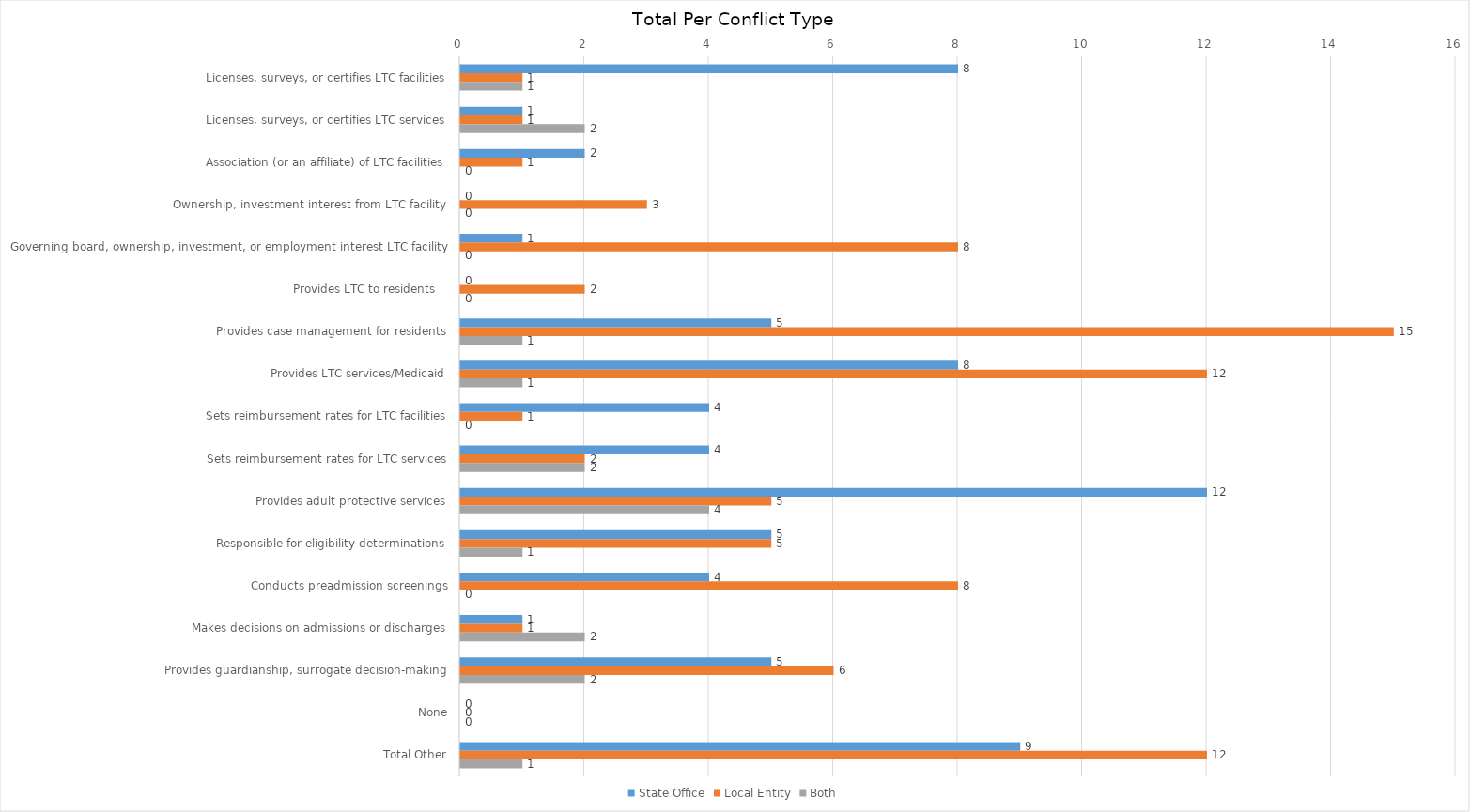
| Category | State Office | Local Entity | Both |
|---|---|---|---|
| Licenses, surveys, or certifies LTC facilities | 8 | 1 | 1 |
| Licenses, surveys, or certifies LTC services | 1 | 1 | 2 |
| Association (or an affiliate) of LTC facilities | 2 | 1 | 0 |
| Ownership, investment interest from LTC facility | 0 | 3 | 0 |
| Governing board, ownership, investment, or employment interest LTC facility | 1 | 8 | 0 |
| Provides LTC to residents    | 0 | 2 | 0 |
| Provides case management for residents | 5 | 15 | 1 |
| Provides LTC services/Medicaid | 8 | 12 | 1 |
| Sets reimbursement rates for LTC facilities | 4 | 1 | 0 |
| Sets reimbursement rates for LTC services | 4 | 2 | 2 |
| Provides adult protective services | 12 | 5 | 4 |
| Responsible for eligibility determinations | 5 | 5 | 1 |
| Conducts preadmission screenings | 4 | 8 | 0 |
| Makes decisions on admissions or discharges | 1 | 1 | 2 |
| Provides guardianship, surrogate decision-making | 5 | 6 | 2 |
| None | 0 | 0 | 0 |
| Total Other | 9 | 12 | 1 |